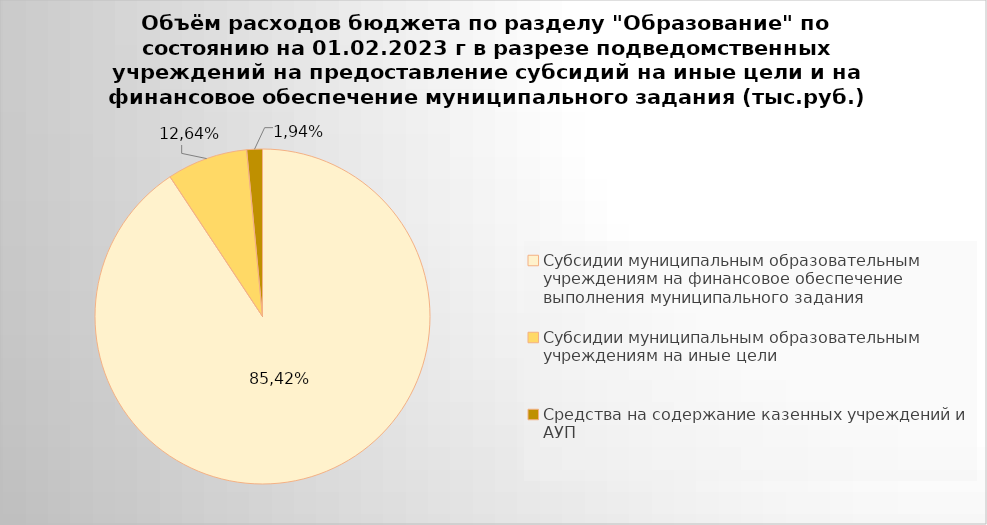
| Category | Series 0 |
|---|---|
| Субсидии муниципальным образовательным учреждениям на финансовое обеспечение выполнения муниципального задания | 7770255.81 |
| Субсидии муниципальным образовательным учреждениям на иные цели | 667507.26 |
| Средства на содержание казенных учреждений и АУП | 129632.6 |